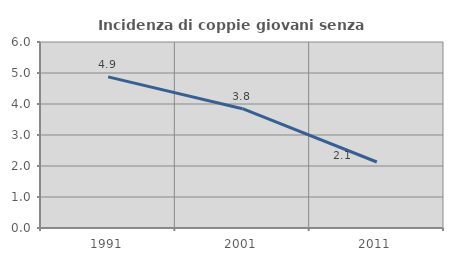
| Category | Incidenza di coppie giovani senza figli |
|---|---|
| 1991.0 | 4.874 |
| 2001.0 | 3.848 |
| 2011.0 | 2.129 |